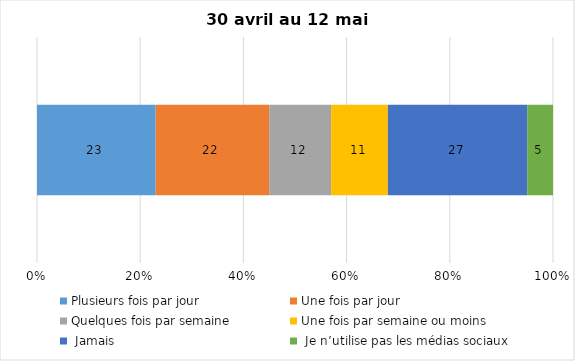
| Category | Plusieurs fois par jour | Une fois par jour | Quelques fois par semaine   | Une fois par semaine ou moins   |  Jamais   |  Je n’utilise pas les médias sociaux |
|---|---|---|---|---|---|---|
| 0 | 23 | 22 | 12 | 11 | 27 | 5 |